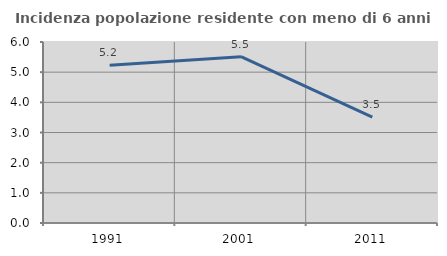
| Category | Incidenza popolazione residente con meno di 6 anni |
|---|---|
| 1991.0 | 5.233 |
| 2001.0 | 5.513 |
| 2011.0 | 3.506 |